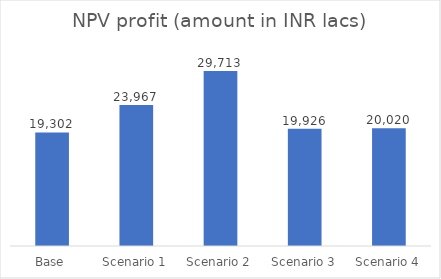
| Category | Series 0 |
|---|---|
| Base | 19301.674 |
| Scenario 1 | 23966.505 |
| Scenario 2 | 29713.042 |
| Scenario 3 | 19925.562 |
| Scenario 4 | 20020.48 |